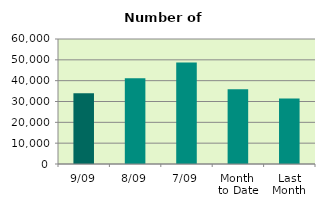
| Category | Series 0 |
|---|---|
| 9/09 | 33954 |
| 8/09 | 41144 |
| 7/09 | 48714 |
| Month 
to Date | 35821.714 |
| Last
Month | 31456 |